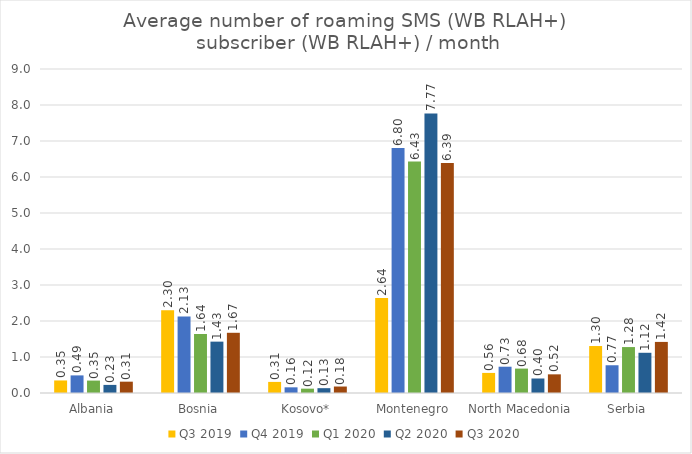
| Category | Q3 2019 | Q4 2019 | Q1 2020 | Q2 2020 | Q3 2020 |
|---|---|---|---|---|---|
| Albania | 0.348 | 0.489 | 0.345 | 0.225 | 0.315 |
| Bosnia | 2.301 | 2.126 | 1.64 | 1.427 | 1.673 |
| Kosovo* | 0.308 | 0.158 | 0.121 | 0.134 | 0.18 |
| Montenegro | 2.635 | 6.805 | 6.429 | 7.767 | 6.392 |
| North Macedonia | 0.558 | 0.73 | 0.678 | 0.403 | 0.518 |
| Serbia | 1.305 | 0.771 | 1.276 | 1.117 | 1.419 |